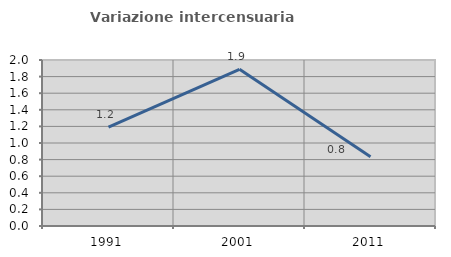
| Category | Variazione intercensuaria annua |
|---|---|
| 1991.0 | 1.19 |
| 2001.0 | 1.887 |
| 2011.0 | 0.833 |